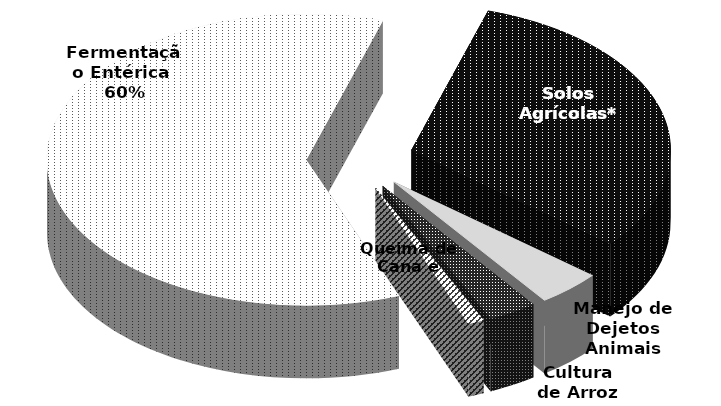
| Category | contribuição nas emissões de GEE |
|---|---|
| Fermentação Entérica | 0.6 |
| Solos Agrícolas* | 0.31 |
| Manejo de Dejetos Animais | 0.04 |
| Cultura de Arroz | 0.03 |
| Queima de Cana e Algodão | 0.01 |